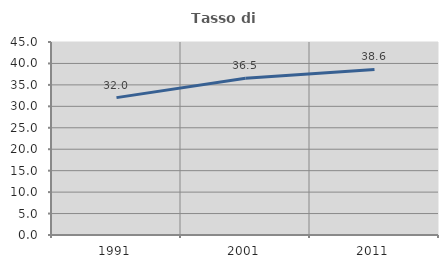
| Category | Tasso di occupazione   |
|---|---|
| 1991.0 | 32.028 |
| 2001.0 | 36.546 |
| 2011.0 | 38.614 |